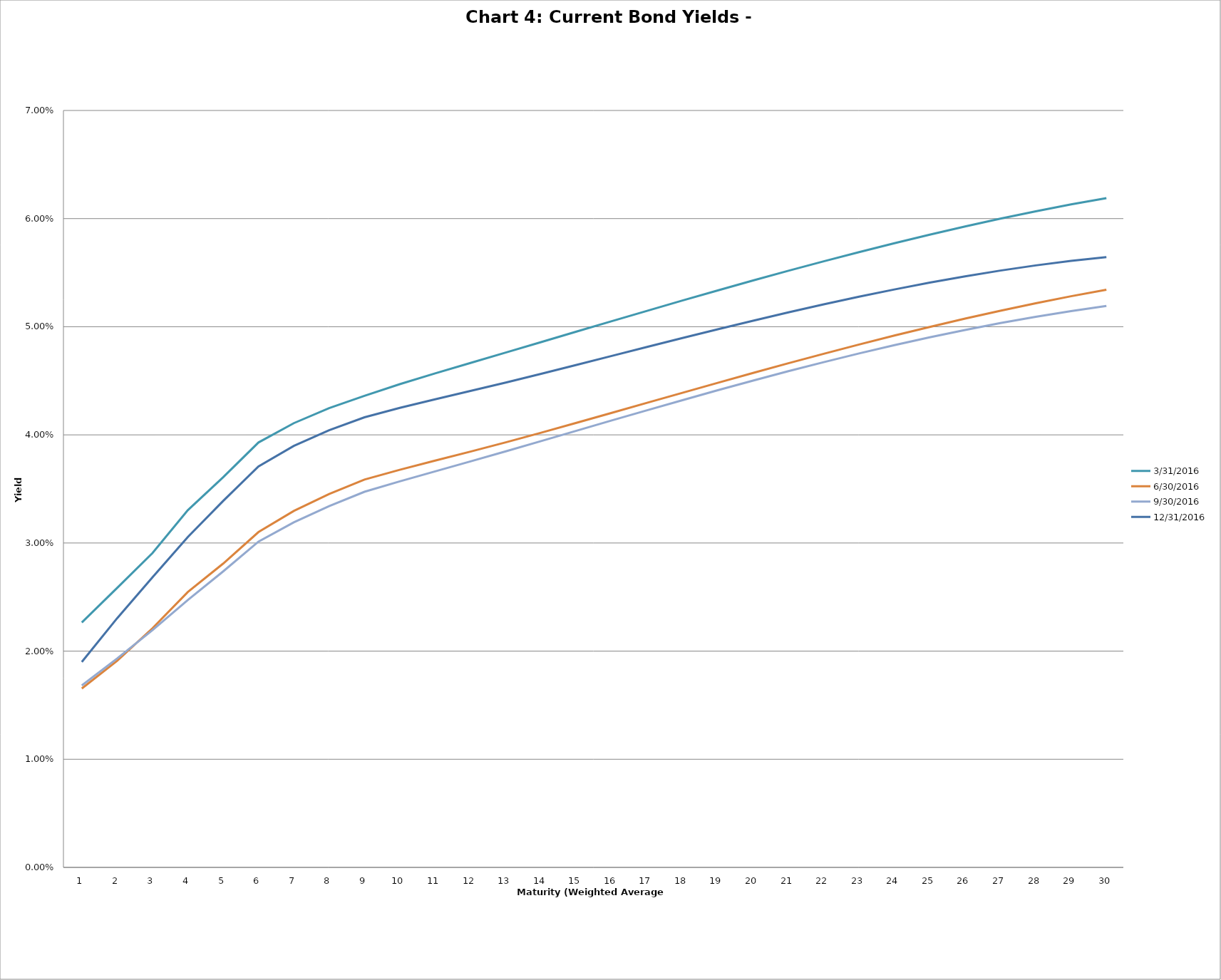
| Category | 3/31/2016 | 6/30/2016 | 9/30/2016 | 12/31/2016 |
|---|---|---|---|---|
| 0 | 0.023 | 0.017 | 0.017 | 0.019 |
| 1 | 0.026 | 0.019 | 0.019 | 0.023 |
| 2 | 0.029 | 0.022 | 0.022 | 0.027 |
| 3 | 0.033 | 0.025 | 0.025 | 0.031 |
| 4 | 0.036 | 0.028 | 0.027 | 0.034 |
| 5 | 0.039 | 0.031 | 0.03 | 0.037 |
| 6 | 0.041 | 0.033 | 0.032 | 0.039 |
| 7 | 0.042 | 0.035 | 0.033 | 0.04 |
| 8 | 0.044 | 0.036 | 0.035 | 0.042 |
| 9 | 0.045 | 0.037 | 0.036 | 0.042 |
| 10 | 0.046 | 0.038 | 0.037 | 0.043 |
| 11 | 0.047 | 0.038 | 0.038 | 0.044 |
| 12 | 0.048 | 0.039 | 0.038 | 0.045 |
| 13 | 0.049 | 0.04 | 0.039 | 0.046 |
| 14 | 0.05 | 0.041 | 0.04 | 0.046 |
| 15 | 0.051 | 0.042 | 0.041 | 0.047 |
| 16 | 0.051 | 0.043 | 0.042 | 0.048 |
| 17 | 0.052 | 0.044 | 0.043 | 0.049 |
| 18 | 0.053 | 0.045 | 0.044 | 0.05 |
| 19 | 0.054 | 0.046 | 0.045 | 0.051 |
| 20 | 0.055 | 0.047 | 0.046 | 0.051 |
| 21 | 0.056 | 0.048 | 0.047 | 0.052 |
| 22 | 0.057 | 0.048 | 0.048 | 0.053 |
| 23 | 0.058 | 0.049 | 0.048 | 0.053 |
| 24 | 0.059 | 0.05 | 0.049 | 0.054 |
| 25 | 0.059 | 0.051 | 0.05 | 0.055 |
| 26 | 0.06 | 0.051 | 0.05 | 0.055 |
| 27 | 0.061 | 0.052 | 0.051 | 0.056 |
| 28 | 0.061 | 0.053 | 0.051 | 0.056 |
| 29 | 0.062 | 0.053 | 0.052 | 0.056 |